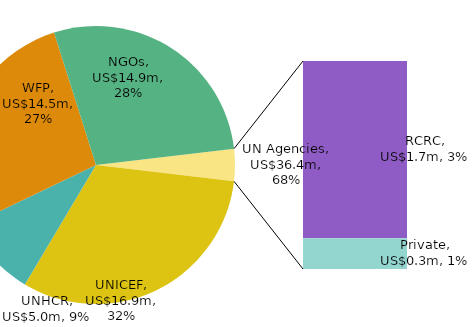
| Category | Series 0 |
|---|---|
| UNICEF | 16.894 |
| UNHCR | 4.976 |
| WFP | 14.525 |
| NGOs | 14.938 |
| RCRC | 1.705 |
| Private | 0.295 |